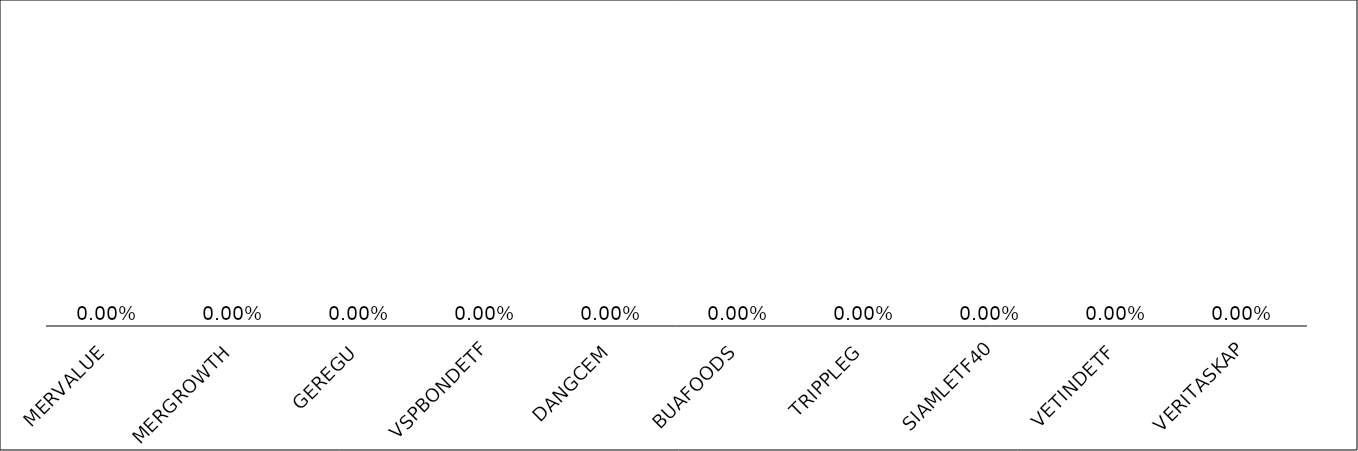
| Category | Series 0 |
|---|---|
| MERVALUE | 15.576 |
| MERGROWTH | 13.851 |
| GEREGU | 1.506 |
| VSPBONDETF | 1.5 |
| DANGCEM | 1.053 |
| BUAFOODS | 0.964 |
| TRIPPLEG | 0.921 |
| SIAMLETF40 | 0.834 |
| VETINDETF | 0.811 |
| VERITASKAP | 0.784 |